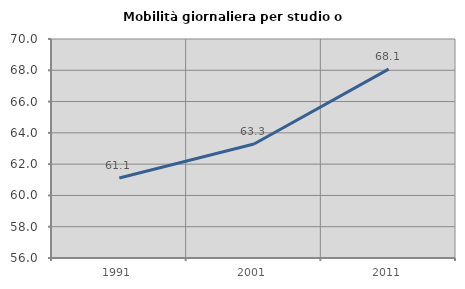
| Category | Mobilità giornaliera per studio o lavoro |
|---|---|
| 1991.0 | 61.112 |
| 2001.0 | 63.287 |
| 2011.0 | 68.072 |